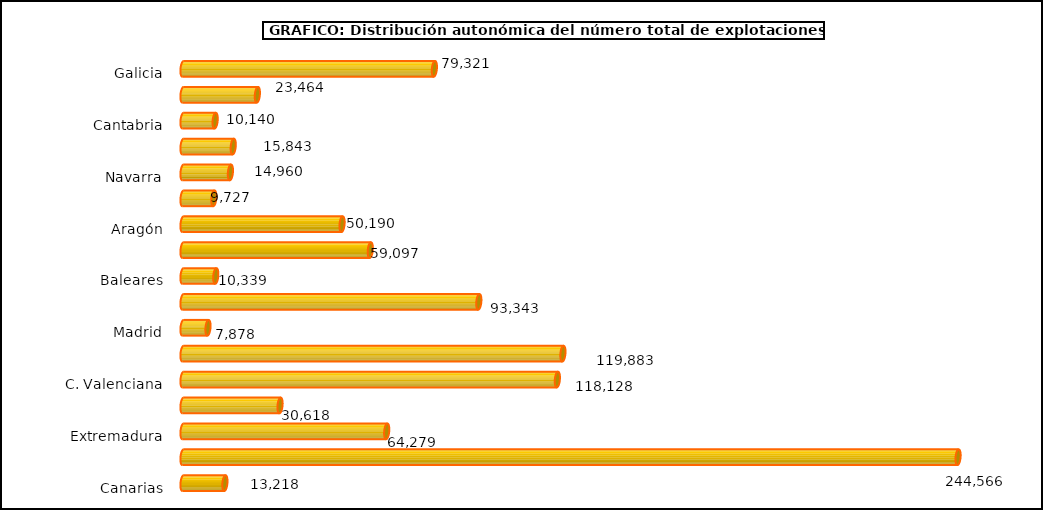
| Category | num. Explotaciones |
|---|---|
|   Galicia | 79321 |
|   P. de Asturias | 23464 |
|   Cantabria | 10140 |
|   País Vasco | 15843 |
|   Navarra | 14960 |
|   La Rioja | 9727 |
|   Aragón | 50190 |
|   Cataluña | 59097 |
|   Baleares | 10339 |
|   Castilla y León | 93343 |
|   Madrid | 7878 |
|   Castilla-La Mancha | 119883 |
|   C. Valenciana | 118128 |
|   R. de Murcia | 30618 |
|   Extremadura | 64279 |
|   Andalucía | 244566 |
|   Canarias | 13218 |